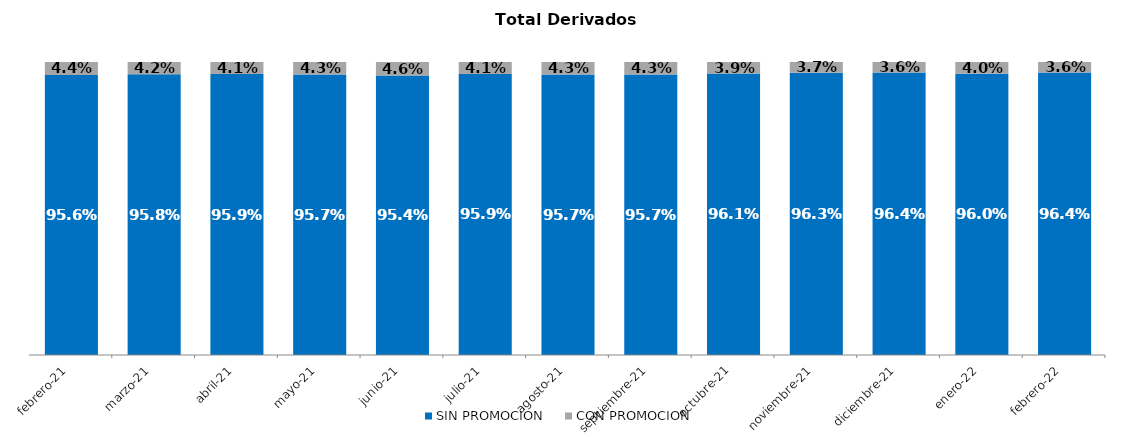
| Category | SIN PROMOCION   | CON PROMOCION   |
|---|---|---|
| 2021-02-01 | 0.956 | 0.044 |
| 2021-03-01 | 0.958 | 0.042 |
| 2021-04-01 | 0.959 | 0.041 |
| 2021-05-01 | 0.957 | 0.043 |
| 2021-06-01 | 0.954 | 0.046 |
| 2021-07-01 | 0.959 | 0.041 |
| 2021-08-01 | 0.957 | 0.043 |
| 2021-09-01 | 0.957 | 0.043 |
| 2021-10-01 | 0.961 | 0.039 |
| 2021-11-01 | 0.963 | 0.037 |
| 2021-12-01 | 0.964 | 0.036 |
| 2022-01-01 | 0.96 | 0.04 |
| 2022-02-01 | 0.964 | 0.036 |